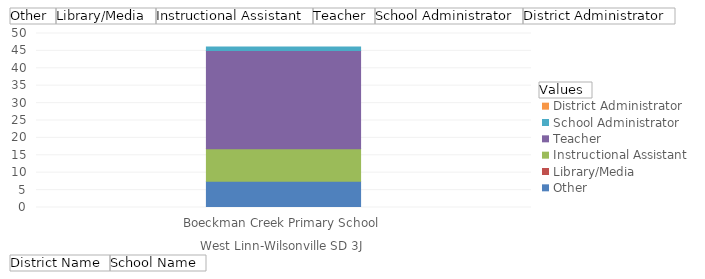
| Category | Other | Library/Media | Instructional Assistant | Teacher | School Administrator | District Administrator |
|---|---|---|---|---|---|---|
| 0 | 7.56 | 0 | 9.35 | 28.23 | 1 | 0 |